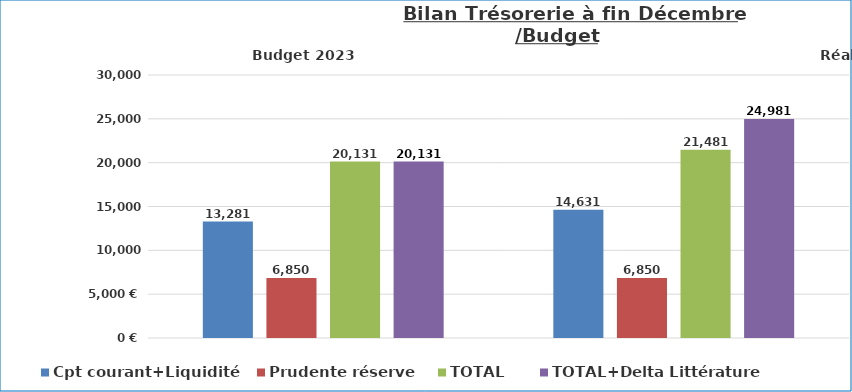
| Category | Cpt courant+Liquidité | Prudente réserve | TOTAL | TOTAL+Delta Littérature |
|---|---|---|---|---|
| Budget | 13281 | 6850 | 20131 | 20131 |
| 2023 | 14631.3 | 6850 | 21481.3 | 24980.77 |